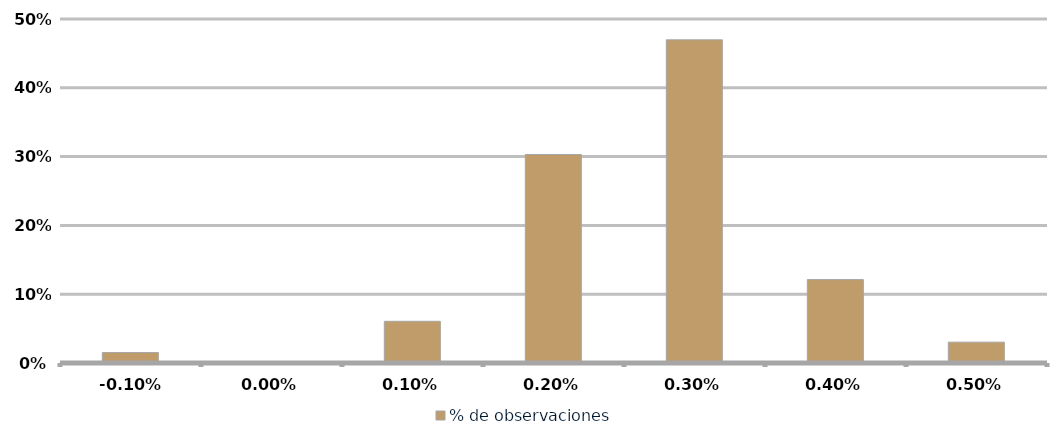
| Category | % de observaciones  |
|---|---|
| -0.001 | 0.015 |
| 0.0 | 0 |
| 0.001 | 0.061 |
| 0.002 | 0.303 |
| 0.003 | 0.47 |
| 0.004 | 0.121 |
| 0.005 | 0.03 |